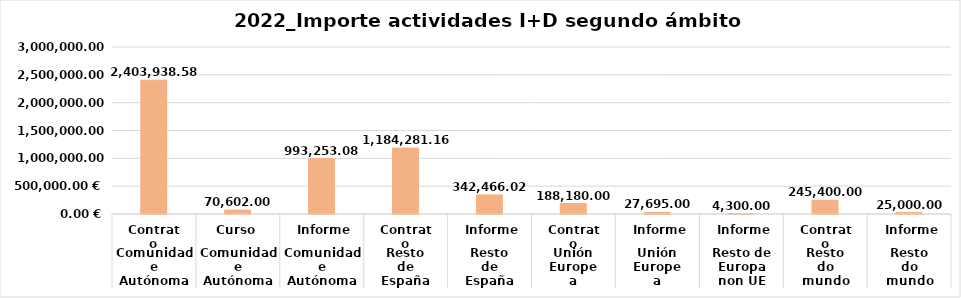
| Category | Series 1 | Series 0 |
|---|---|---|
| 0 | 2403938.58 |  |
| 1 | 70602 |  |
| 2 | 993253.08 |  |
| 3 | 1184281.16 |  |
| 4 | 342466.02 |  |
| 5 | 188180 |  |
| 6 | 27695 |  |
| 7 | 4300 |  |
| 8 | 245400 |  |
| 9 | 25000 |  |